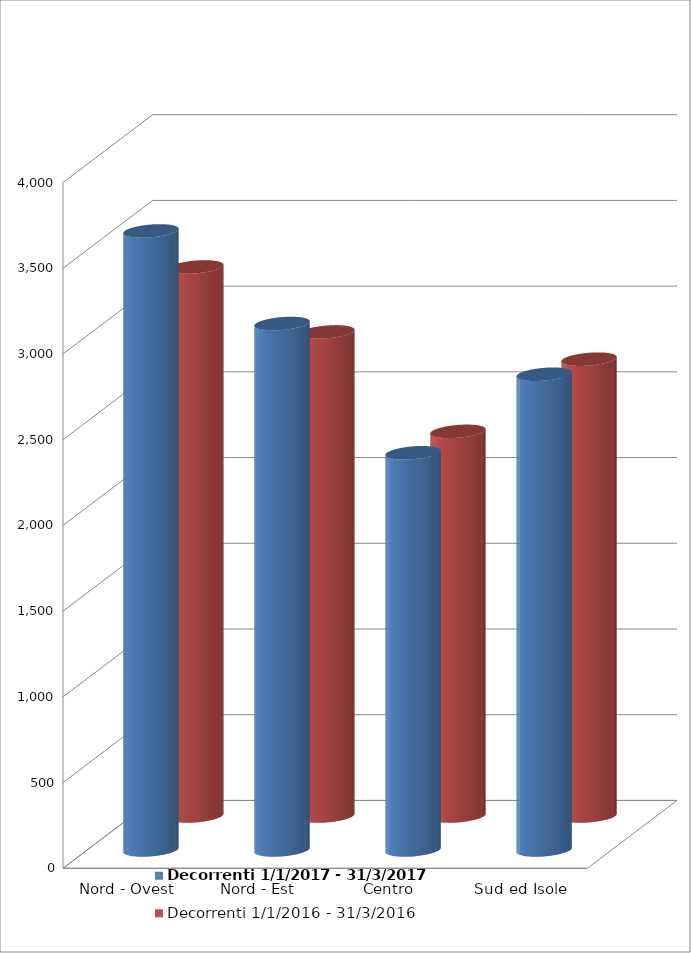
| Category | Decorrenti 1/1/2017 - 31/3/2017 | Decorrenti 1/1/2016 - 31/3/2016 |
|---|---|---|
| Nord - Ovest | 3611 | 3203 |
| Nord - Est | 3071 | 2824 |
| Centro | 2317 | 2244 |
| Sud ed Isole | 2775 | 2665 |